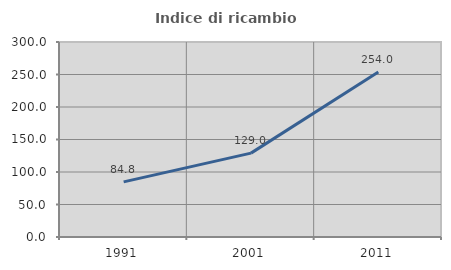
| Category | Indice di ricambio occupazionale  |
|---|---|
| 1991.0 | 84.81 |
| 2001.0 | 129.032 |
| 2011.0 | 254 |